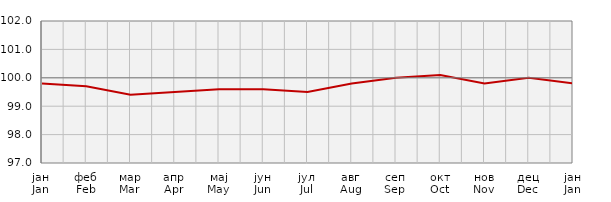
| Category | Индекси цијена произвођача
Producer price indices |
|---|---|
| јан
Jan | 99.8 |
| феб
Feb | 99.7 |
| мар
Mar | 99.4 |
| апр
Apr | 99.5 |
| мај
May | 99.6 |
| јун
Jun | 99.6 |
| јул
Jul | 99.5 |
| авг
Aug | 99.8 |
| сеп
Sep | 100 |
| окт
Oct | 100.1 |
| нов
Nov | 99.8 |
| дец
Dec | 100 |
| јан
Jan | 99.8 |